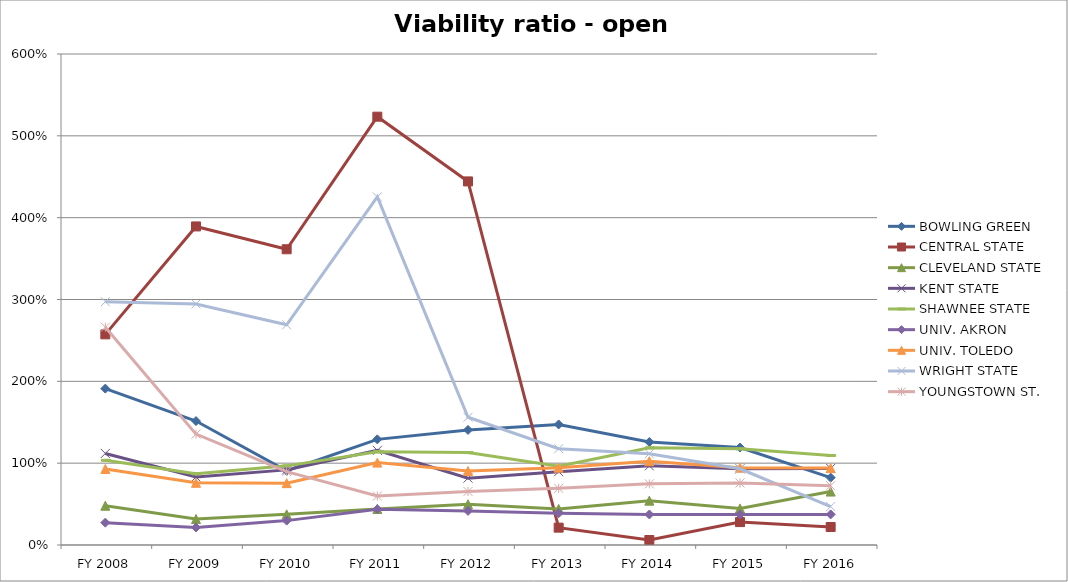
| Category | BOWLING GREEN  | CENTRAL STATE  | CLEVELAND STATE  | KENT STATE  | SHAWNEE STATE  | UNIV. AKRON  | UNIV. TOLEDO  | WRIGHT STATE  | YOUNGSTOWN ST.  |
|---|---|---|---|---|---|---|---|---|---|
| FY 2016 | 0.823 | 0.22 | 0.653 | 0.936 | 1.094 | 0.374 | 0.94 | 0.47 | 0.725 |
| FY 2015 | 1.191 | 0.28 | 0.447 | 0.931 | 1.175 | 0.372 | 0.944 | 0.931 | 0.758 |
| FY 2014 | 1.258 | 0.061 | 0.542 | 0.967 | 1.188 | 0.373 | 1.024 | 1.116 | 0.747 |
| FY 2013 | 1.473 | 0.212 | 0.441 | 0.896 | 0.964 | 0.388 | 0.944 | 1.177 | 0.693 |
| FY 2012 | 1.406 | 4.443 | 0.499 | 0.817 | 1.129 | 0.417 | 0.904 | 1.561 | 0.654 |
| FY 2011 | 1.291 | 5.234 | 0.44 | 1.156 | 1.139 | 0.438 | 1.007 | 4.254 | 0.598 |
| FY 2010 | 0.907 | 3.614 | 0.375 | 0.918 | 0.967 | 0.298 | 0.756 | 2.691 | 0.896 |
| FY 2009 | 1.515 | 3.893 | 0.317 | 0.831 | 0.87 | 0.214 | 0.76 | 2.946 | 1.355 |
| FY 2008 | 1.911 | 2.574 | 0.48 | 1.119 | 1.035 | 0.273 | 0.929 | 2.973 | 2.662 |